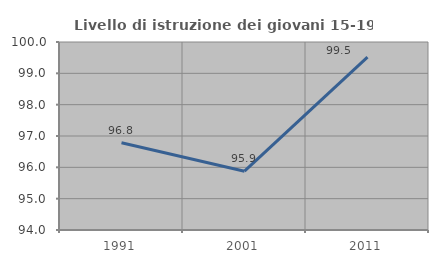
| Category | Livello di istruzione dei giovani 15-19 anni |
|---|---|
| 1991.0 | 96.784 |
| 2001.0 | 95.876 |
| 2011.0 | 99.515 |